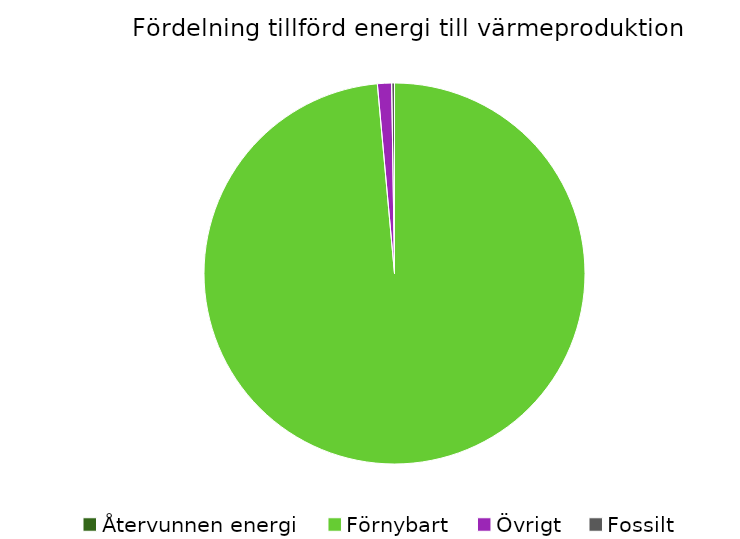
| Category | Fördelning värmeproduktion |
|---|---|
| Återvunnen energi | 0 |
| Förnybart | 0.986 |
| Övrigt | 0.012 |
| Fossilt | 0.002 |